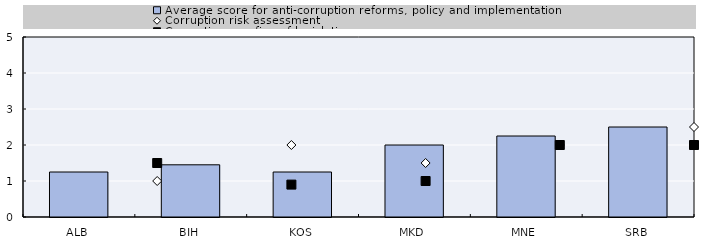
| Category | Average score for anti-corruption reforms, policy and implementation |
|---|---|
| ALB | 1.25 |
| BIH | 1.45 |
| KOS | 1.25 |
| MKD | 2 |
| MNE | 2.25 |
| SRB | 2.5 |